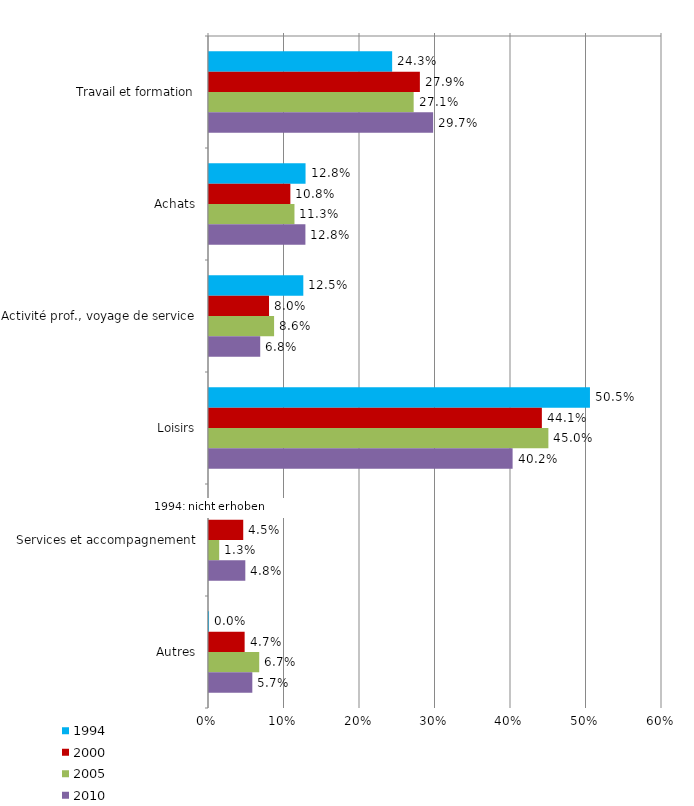
| Category | 1994 | 2000 | 2005 | 2010 |
|---|---|---|---|---|
| Travail et formation | 24.258 | 27.93 | 27.107 | 29.686 |
| Achats | 12.788 | 10.776 | 11.321 | 12.769 |
| Activité prof., voyage de service | 12.492 | 7.951 | 8.621 | 6.785 |
| Loisirs | 50.458 | 44.088 | 44.951 | 40.213 |
| Services et accompagnement | 0 | 4.535 | 1.349 | 4.81 |
| Autres | 0.004 | 4.72 | 6.651 | 5.738 |